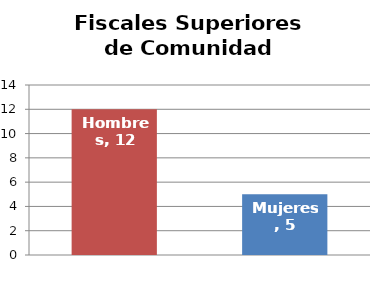
| Category | Fiscales Superiores de Comunidad Autónoma |
|---|---|
| Hombres | 12 |
| Mujeres | 5 |